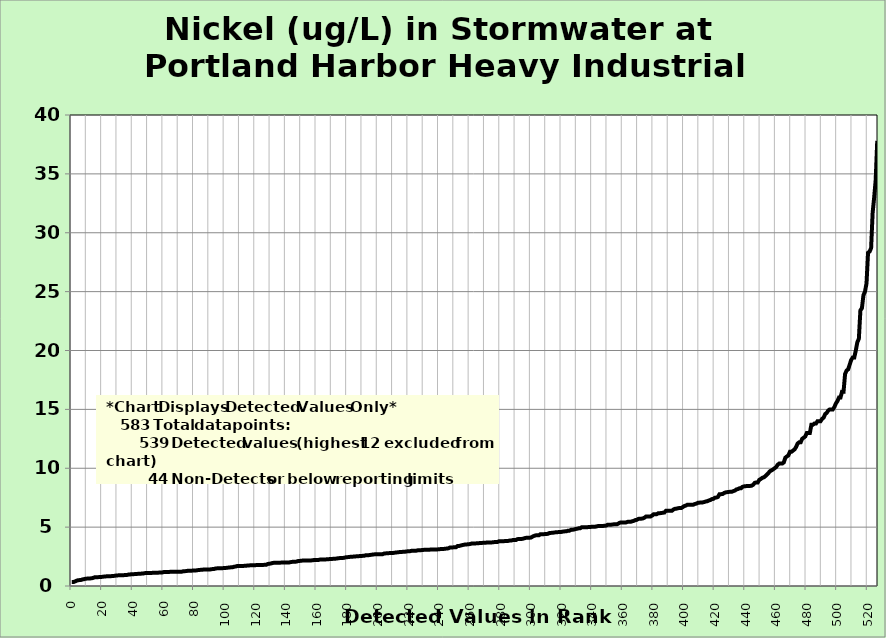
| Category | Nickel |
|---|---|
| 0.0 | 0.33 |
| 1.0 | 0.331 |
| 2.0 | 0.38 |
| 3.0 | 0.44 |
| 4.0 | 0.49 |
| 5.0 | 0.5 |
| 6.0 | 0.51 |
| 7.0 | 0.56 |
| 8.0 | 0.58 |
| 9.0 | 0.62 |
| 10.0 | 0.628 |
| 11.0 | 0.634 |
| 12.0 | 0.644 |
| 13.0 | 0.655 |
| 14.0 | 0.69 |
| 15.0 | 0.741 |
| 16.0 | 0.743 |
| 17.0 | 0.75 |
| 18.0 | 0.757 |
| 19.0 | 0.768 |
| 20.0 | 0.778 |
| 21.0 | 0.8 |
| 22.0 | 0.813 |
| 23.0 | 0.822 |
| 24.0 | 0.83 |
| 25.0 | 0.83 |
| 26.0 | 0.84 |
| 27.0 | 0.844 |
| 28.0 | 0.867 |
| 29.0 | 0.89 |
| 30.0 | 0.9 |
| 31.0 | 0.91 |
| 32.0 | 0.91 |
| 33.0 | 0.919 |
| 34.0 | 0.922 |
| 35.0 | 0.93 |
| 36.0 | 0.935 |
| 37.0 | 0.97 |
| 38.0 | 0.98 |
| 39.0 | 1 |
| 40.0 | 1 |
| 41.0 | 1.01 |
| 42.0 | 1.02 |
| 43.0 | 1.03 |
| 44.0 | 1.04 |
| 45.0 | 1.04 |
| 46.0 | 1.07 |
| 47.0 | 1.07 |
| 48.0 | 1.1 |
| 49.0 | 1.1 |
| 50.0 | 1.1 |
| 51.0 | 1.11 |
| 52.0 | 1.11 |
| 53.0 | 1.12 |
| 54.0 | 1.12 |
| 55.0 | 1.12 |
| 56.0 | 1.12 |
| 57.0 | 1.14 |
| 58.0 | 1.14 |
| 59.0 | 1.15 |
| 60.0 | 1.18 |
| 61.0 | 1.18 |
| 62.0 | 1.18 |
| 63.0 | 1.18 |
| 64.0 | 1.2 |
| 65.0 | 1.2 |
| 66.0 | 1.2 |
| 67.0 | 1.2 |
| 68.0 | 1.2 |
| 69.0 | 1.22 |
| 70.0 | 1.22 |
| 71.0 | 1.22 |
| 72.0 | 1.22 |
| 73.0 | 1.26 |
| 74.0 | 1.26 |
| 75.0 | 1.27 |
| 76.0 | 1.3 |
| 77.0 | 1.3 |
| 78.0 | 1.3 |
| 79.0 | 1.31 |
| 80.0 | 1.31 |
| 81.0 | 1.32 |
| 82.0 | 1.34 |
| 83.0 | 1.36 |
| 84.0 | 1.37 |
| 85.0 | 1.37 |
| 86.0 | 1.4 |
| 87.0 | 1.4 |
| 88.0 | 1.4 |
| 89.0 | 1.4 |
| 90.0 | 1.4 |
| 91.0 | 1.42 |
| 92.0 | 1.44 |
| 93.0 | 1.45 |
| 94.0 | 1.49 |
| 95.0 | 1.5 |
| 96.0 | 1.5 |
| 97.0 | 1.5 |
| 98.0 | 1.51 |
| 99.0 | 1.52 |
| 100.0 | 1.53 |
| 101.0 | 1.54 |
| 102.0 | 1.56 |
| 103.0 | 1.57 |
| 104.0 | 1.59 |
| 105.0 | 1.59 |
| 106.0 | 1.64 |
| 107.0 | 1.65 |
| 108.0 | 1.7 |
| 109.0 | 1.7 |
| 110.0 | 1.7 |
| 111.0 | 1.7 |
| 112.0 | 1.7 |
| 113.0 | 1.72 |
| 114.0 | 1.72 |
| 115.0 | 1.75 |
| 116.0 | 1.75 |
| 117.0 | 1.76 |
| 118.0 | 1.76 |
| 119.0 | 1.76 |
| 120.0 | 1.77 |
| 121.0 | 1.78 |
| 122.0 | 1.78 |
| 123.0 | 1.79 |
| 124.0 | 1.79 |
| 125.0 | 1.79 |
| 126.0 | 1.8 |
| 127.0 | 1.8 |
| 128.0 | 1.87 |
| 129.0 | 1.89 |
| 130.0 | 1.91 |
| 131.0 | 1.95 |
| 132.0 | 1.97 |
| 133.0 | 1.97 |
| 134.0 | 1.98 |
| 135.0 | 1.98 |
| 136.0 | 1.98 |
| 137.0 | 1.99 |
| 138.0 | 1.99 |
| 139.0 | 1.99 |
| 140.0 | 2 |
| 141.0 | 2 |
| 142.0 | 2 |
| 143.0 | 2.03 |
| 144.0 | 2.05 |
| 145.0 | 2.05 |
| 146.0 | 2.06 |
| 147.0 | 2.08 |
| 148.0 | 2.13 |
| 149.0 | 2.13 |
| 150.0 | 2.15 |
| 151.0 | 2.16 |
| 152.0 | 2.16 |
| 153.0 | 2.16 |
| 154.0 | 2.17 |
| 155.0 | 2.17 |
| 156.0 | 2.17 |
| 157.0 | 2.18 |
| 158.0 | 2.2 |
| 159.0 | 2.2 |
| 160.0 | 2.2 |
| 161.0 | 2.21 |
| 162.0 | 2.24 |
| 163.0 | 2.24 |
| 164.0 | 2.25 |
| 165.0 | 2.26 |
| 166.0 | 2.26 |
| 167.0 | 2.28 |
| 168.0 | 2.28 |
| 169.0 | 2.3 |
| 170.0 | 2.3 |
| 171.0 | 2.31 |
| 172.0 | 2.32 |
| 173.0 | 2.33 |
| 174.0 | 2.36 |
| 175.0 | 2.37 |
| 176.0 | 2.37 |
| 177.0 | 2.38 |
| 178.0 | 2.4 |
| 179.0 | 2.44 |
| 180.0 | 2.45 |
| 181.0 | 2.46 |
| 182.0 | 2.48 |
| 183.0 | 2.48 |
| 184.0 | 2.5 |
| 185.0 | 2.5 |
| 186.0 | 2.53 |
| 187.0 | 2.53 |
| 188.0 | 2.54 |
| 189.0 | 2.55 |
| 190.0 | 2.56 |
| 191.0 | 2.57 |
| 192.0 | 2.61 |
| 193.0 | 2.62 |
| 194.0 | 2.62 |
| 195.0 | 2.64 |
| 196.0 | 2.66 |
| 197.0 | 2.68 |
| 198.0 | 2.69 |
| 199.0 | 2.69 |
| 200.0 | 2.7 |
| 201.0 | 2.7 |
| 202.0 | 2.7 |
| 203.0 | 2.7 |
| 204.0 | 2.76 |
| 205.0 | 2.77 |
| 206.0 | 2.78 |
| 207.0 | 2.79 |
| 208.0 | 2.8 |
| 209.0 | 2.81 |
| 210.0 | 2.81 |
| 211.0 | 2.83 |
| 212.0 | 2.85 |
| 213.0 | 2.86 |
| 214.0 | 2.88 |
| 215.0 | 2.88 |
| 216.0 | 2.9 |
| 217.0 | 2.9 |
| 218.0 | 2.92 |
| 219.0 | 2.94 |
| 220.0 | 2.96 |
| 221.0 | 2.96 |
| 222.0 | 2.99 |
| 223.0 | 2.99 |
| 224.0 | 3 |
| 225.0 | 3 |
| 226.0 | 3.03 |
| 227.0 | 3.03 |
| 228.0 | 3.04 |
| 229.0 | 3.06 |
| 230.0 | 3.07 |
| 231.0 | 3.07 |
| 232.0 | 3.07 |
| 233.0 | 3.07 |
| 234.0 | 3.09 |
| 235.0 | 3.1 |
| 236.0 | 3.1 |
| 237.0 | 3.1 |
| 238.0 | 3.1 |
| 239.0 | 3.11 |
| 240.0 | 3.12 |
| 241.0 | 3.14 |
| 242.0 | 3.14 |
| 243.0 | 3.15 |
| 244.0 | 3.17 |
| 245.0 | 3.18 |
| 246.0 | 3.2 |
| 247.0 | 3.27 |
| 248.0 | 3.28 |
| 249.0 | 3.28 |
| 250.0 | 3.3 |
| 251.0 | 3.3 |
| 252.0 | 3.4 |
| 253.0 | 3.4 |
| 254.0 | 3.44 |
| 255.0 | 3.47 |
| 256.0 | 3.5 |
| 257.0 | 3.53 |
| 258.0 | 3.53 |
| 259.0 | 3.55 |
| 260.0 | 3.56 |
| 261.0 | 3.6 |
| 262.0 | 3.6 |
| 263.0 | 3.61 |
| 264.0 | 3.62 |
| 265.0 | 3.62 |
| 266.0 | 3.64 |
| 267.0 | 3.66 |
| 268.0 | 3.66 |
| 269.0 | 3.67 |
| 270.0 | 3.67 |
| 271.0 | 3.69 |
| 272.0 | 3.69 |
| 273.0 | 3.7 |
| 274.0 | 3.7 |
| 275.0 | 3.71 |
| 276.0 | 3.73 |
| 277.0 | 3.73 |
| 278.0 | 3.74 |
| 279.0 | 3.8 |
| 280.0 | 3.8 |
| 281.0 | 3.8 |
| 282.0 | 3.8 |
| 283.0 | 3.82 |
| 284.0 | 3.83 |
| 285.0 | 3.83 |
| 286.0 | 3.86 |
| 287.0 | 3.86 |
| 288.0 | 3.9 |
| 289.0 | 3.9 |
| 290.0 | 3.9 |
| 291.0 | 3.98 |
| 292.0 | 3.99 |
| 293.0 | 3.99 |
| 294.0 | 4 |
| 295.0 | 4.03 |
| 296.0 | 4.07 |
| 297.0 | 4.1 |
| 298.0 | 4.1 |
| 299.0 | 4.1 |
| 300.0 | 4.12 |
| 301.0 | 4.2 |
| 302.0 | 4.26 |
| 303.0 | 4.3 |
| 304.0 | 4.3 |
| 305.0 | 4.3 |
| 306.0 | 4.4 |
| 307.0 | 4.4 |
| 308.0 | 4.4 |
| 309.0 | 4.41 |
| 310.0 | 4.41 |
| 311.0 | 4.44 |
| 312.0 | 4.5 |
| 313.0 | 4.51 |
| 314.0 | 4.52 |
| 315.0 | 4.54 |
| 316.0 | 4.56 |
| 317.0 | 4.57 |
| 318.0 | 4.58 |
| 319.0 | 4.58 |
| 320.0 | 4.6 |
| 321.0 | 4.63 |
| 322.0 | 4.64 |
| 323.0 | 4.64 |
| 324.0 | 4.7 |
| 325.0 | 4.7 |
| 326.0 | 4.77 |
| 327.0 | 4.77 |
| 328.0 | 4.8 |
| 329.0 | 4.84 |
| 330.0 | 4.86 |
| 331.0 | 4.9 |
| 332.0 | 4.9 |
| 333.0 | 4.99 |
| 334.0 | 5 |
| 335.0 | 5 |
| 336.0 | 5 |
| 337.0 | 5 |
| 338.0 | 5.01 |
| 339.0 | 5.02 |
| 340.0 | 5.03 |
| 341.0 | 5.04 |
| 342.0 | 5.04 |
| 343.0 | 5.07 |
| 344.0 | 5.1 |
| 345.0 | 5.1 |
| 346.0 | 5.1 |
| 347.0 | 5.1 |
| 348.0 | 5.12 |
| 349.0 | 5.13 |
| 350.0 | 5.2 |
| 351.0 | 5.2 |
| 352.0 | 5.2 |
| 353.0 | 5.22 |
| 354.0 | 5.24 |
| 355.0 | 5.24 |
| 356.0 | 5.24 |
| 357.0 | 5.31 |
| 358.0 | 5.38 |
| 359.0 | 5.4 |
| 360.0 | 5.4 |
| 361.0 | 5.4 |
| 362.0 | 5.4 |
| 363.0 | 5.45 |
| 364.0 | 5.45 |
| 365.0 | 5.45 |
| 366.0 | 5.5 |
| 367.0 | 5.53 |
| 368.0 | 5.6 |
| 369.0 | 5.62 |
| 370.0 | 5.7 |
| 371.0 | 5.72 |
| 372.0 | 5.72 |
| 373.0 | 5.74 |
| 374.0 | 5.8 |
| 375.0 | 5.9 |
| 376.0 | 5.9 |
| 377.0 | 5.9 |
| 378.0 | 5.91 |
| 379.0 | 5.98 |
| 380.0 | 6.1 |
| 381.0 | 6.1 |
| 382.0 | 6.1 |
| 383.0 | 6.18 |
| 384.0 | 6.18 |
| 385.0 | 6.2 |
| 386.0 | 6.22 |
| 387.0 | 6.24 |
| 388.0 | 6.39 |
| 389.0 | 6.39 |
| 390.0 | 6.4 |
| 391.0 | 6.4 |
| 392.0 | 6.4 |
| 393.0 | 6.5 |
| 394.0 | 6.56 |
| 395.0 | 6.57 |
| 396.0 | 6.61 |
| 397.0 | 6.62 |
| 398.0 | 6.62 |
| 399.0 | 6.7 |
| 400.0 | 6.79 |
| 401.0 | 6.83 |
| 402.0 | 6.9 |
| 403.0 | 6.9 |
| 404.0 | 6.9 |
| 405.0 | 6.9 |
| 406.0 | 6.91 |
| 407.0 | 6.97 |
| 408.0 | 7 |
| 409.0 | 7.07 |
| 410.0 | 7.08 |
| 411.0 | 7.1 |
| 412.0 | 7.1 |
| 413.0 | 7.13 |
| 414.0 | 7.18 |
| 415.0 | 7.2 |
| 416.0 | 7.26 |
| 417.0 | 7.3 |
| 418.0 | 7.38 |
| 419.0 | 7.4 |
| 420.0 | 7.5 |
| 421.0 | 7.51 |
| 422.0 | 7.57 |
| 423.0 | 7.8 |
| 424.0 | 7.8 |
| 425.0 | 7.81 |
| 426.0 | 7.9 |
| 427.0 | 7.95 |
| 428.0 | 7.97 |
| 429.0 | 7.99 |
| 430.0 | 8 |
| 431.0 | 8 |
| 432.0 | 8.06 |
| 433.0 | 8.1 |
| 434.0 | 8.2 |
| 435.0 | 8.23 |
| 436.0 | 8.3 |
| 437.0 | 8.3 |
| 438.0 | 8.42 |
| 439.0 | 8.46 |
| 440.0 | 8.47 |
| 441.0 | 8.5 |
| 442.0 | 8.5 |
| 443.0 | 8.5 |
| 444.0 | 8.52 |
| 445.0 | 8.6 |
| 446.0 | 8.76 |
| 447.0 | 8.8 |
| 448.0 | 8.8 |
| 449.0 | 9.02 |
| 450.0 | 9.09 |
| 451.0 | 9.19 |
| 452.0 | 9.23 |
| 453.0 | 9.34 |
| 454.0 | 9.46 |
| 455.0 | 9.6 |
| 456.0 | 9.76 |
| 457.0 | 9.82 |
| 458.0 | 9.91 |
| 459.0 | 10 |
| 460.0 | 10.1 |
| 461.0 | 10.3 |
| 462.0 | 10.4 |
| 463.0 | 10.4 |
| 464.0 | 10.4 |
| 465.0 | 10.5 |
| 466.0 | 10.9 |
| 467.0 | 11 |
| 468.0 | 11.1 |
| 469.0 | 11.4 |
| 470.0 | 11.4 |
| 471.0 | 11.5 |
| 472.0 | 11.6 |
| 473.0 | 11.8 |
| 474.0 | 12.1 |
| 475.0 | 12.2 |
| 476.0 | 12.2 |
| 477.0 | 12.5 |
| 478.0 | 12.6 |
| 479.0 | 12.7 |
| 480.0 | 13 |
| 481.0 | 13 |
| 482.0 | 13 |
| 483.0 | 13.7 |
| 484.0 | 13.7 |
| 485.0 | 13.8 |
| 486.0 | 13.8 |
| 487.0 | 14 |
| 488.0 | 14 |
| 489.0 | 14 |
| 490.0 | 14.2 |
| 491.0 | 14.3 |
| 492.0 | 14.6 |
| 493.0 | 14.7 |
| 494.0 | 14.9 |
| 495.0 | 15 |
| 496.0 | 15 |
| 497.0 | 15 |
| 498.0 | 15.2 |
| 499.0 | 15.5 |
| 500.0 | 15.7 |
| 501.0 | 16 |
| 502.0 | 16 |
| 503.0 | 16.5 |
| 504.0 | 16.5 |
| 505.0 | 18 |
| 506.0 | 18.3 |
| 507.0 | 18.4 |
| 508.0 | 18.8 |
| 509.0 | 19.2 |
| 510.0 | 19.4 |
| 511.0 | 19.4 |
| 512.0 | 20 |
| 513.0 | 20.7 |
| 514.0 | 21 |
| 515.0 | 23.4 |
| 516.0 | 23.6 |
| 517.0 | 24.7 |
| 518.0 | 25 |
| 519.0 | 25.7 |
| 520.0 | 28.3 |
| 521.0 | 28.4 |
| 522.0 | 28.7 |
| 523.0 | 31.7 |
| 524.0 | 33 |
| 525.0 | 34.5 |
| 526.0 | 37.8 |